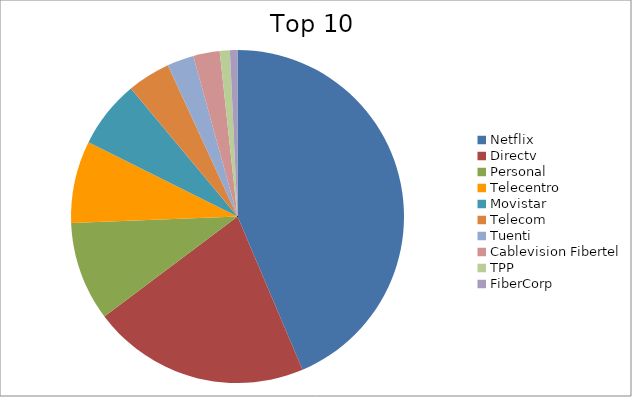
| Category | Series 0 |
|---|---|
| Netflix | 43.61 |
| Directv | 21.14 |
| Personal | 9.63 |
| Telecentro | 7.98 |
| Movistar | 6.58 |
| Telecom | 4.19 |
| Tuenti | 2.59 |
| Cablevision Fibertel | 2.57 |
| TPP | 0.98 |
| FiberCorp | 0.73 |